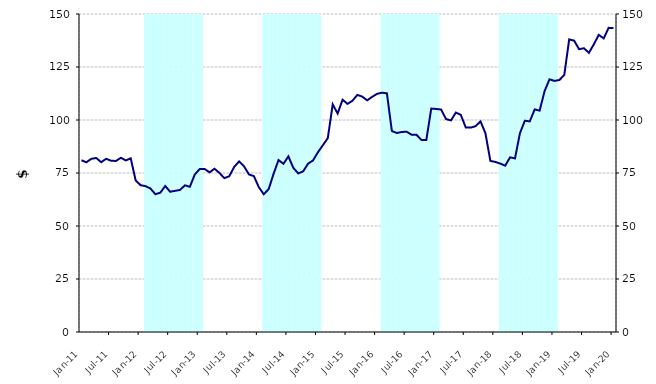
| Category | Series 1 |
|---|---|
| 0 | 0 |
| 1900-01-01 | 0 |
| 1900-01-02 | 0 |
| 1900-01-03 | 0 |
| 1900-01-04 | 0 |
| 1900-01-05 | 0 |
| 1900-01-06 | 0 |
| 1900-01-07 | 0 |
| 1900-01-08 | 0 |
| 1900-01-09 | 0 |
| 1900-01-10 | 0 |
| 1900-01-11 | 0 |
| 1900-01-12 | 0 |
| 1900-01-13 | 150000000 |
| 1900-01-14 | 150000000 |
| 1900-01-15 | 150000000 |
| 1900-01-16 | 150000000 |
| 1900-01-17 | 150000000 |
| 1900-01-18 | 150000000 |
| 1900-01-19 | 150000000 |
| 1900-01-20 | 150000000 |
| 1900-01-21 | 150000000 |
| 1900-01-22 | 150000000 |
| 1900-01-23 | 150000000 |
| 1900-01-24 | 150000000 |
| 1900-01-25 | 0 |
| 1900-01-26 | 0 |
| 1900-01-27 | 0 |
| 1900-01-28 | 0 |
| 1900-01-29 | 0 |
| 1900-01-30 | 0 |
| 1900-01-31 | 0 |
| 1900-02-01 | 0 |
| 1900-02-02 | 0 |
| 1900-02-03 | 0 |
| 1900-02-04 | 0 |
| 1900-02-05 | 0 |
| 1900-02-06 | 150000000 |
| 1900-02-07 | 150000000 |
| 1900-02-08 | 150000000 |
| 1900-02-09 | 150000000 |
| 1900-02-10 | 150000000 |
| 1900-02-11 | 150000000 |
| 1900-02-12 | 150000000 |
| 1900-02-13 | 150000000 |
| 1900-02-14 | 150000000 |
| 1900-02-15 | 150000000 |
| 1900-02-16 | 150000000 |
| 1900-02-17 | 150000000 |
| 1900-02-18 | 0 |
| 1900-02-19 | 0 |
| 1900-02-20 | 0 |
| 1900-02-21 | 0 |
| 1900-02-22 | 0 |
| 1900-02-23 | 0 |
| 1900-02-24 | 0 |
| 1900-02-25 | 0 |
| 1900-02-26 | 0 |
| 1900-02-27 | 0 |
| 1900-02-28 | 0 |
| 1900-02-28 | 0 |
| 1900-03-01 | 150000000 |
| 1900-03-02 | 150000000 |
| 1900-03-03 | 150000000 |
| 1900-03-04 | 150000000 |
| 1900-03-05 | 150000000 |
| 1900-03-06 | 150000000 |
| 1900-03-07 | 150000000 |
| 1900-03-08 | 150000000 |
| 1900-03-09 | 150000000 |
| 1900-03-10 | 150000000 |
| 1900-03-11 | 150000000 |
| 1900-03-12 | 150000000 |
| 1900-03-13 | 0 |
| 1900-03-14 | 0 |
| 1900-03-15 | 0 |
| 1900-03-16 | 0 |
| 1900-03-17 | 0 |
| 1900-03-18 | 0 |
| 1900-03-19 | 0 |
| 1900-03-20 | 0 |
| 1900-03-21 | 0 |
| 1900-03-22 | 0 |
| 1900-03-23 | 0 |
| 1900-03-24 | 0 |
| 1900-03-25 | 150000000 |
| 1900-03-26 | 150000000 |
| 1900-03-27 | 150000000 |
| 1900-03-28 | 150000000 |
| 1900-03-29 | 150000000 |
| 1900-03-30 | 150000000 |
| 1900-03-31 | 150000000 |
| 1900-04-01 | 150000000 |
| 1900-04-02 | 150000000 |
| 1900-04-03 | 150000000 |
| 1900-04-04 | 150000000 |
| 1900-04-05 | 150000000 |
| 1900-04-06 | 0 |
| 1900-04-07 | 0 |
| 1900-04-08 | 0 |
| 1900-04-09 | 0 |
| 1900-04-10 | 0 |
| 1900-04-11 | 0 |
| 1900-04-12 | 0 |
| 1900-04-13 | 0 |
| 1900-04-14 | 0 |
| 1900-04-15 | 0 |
| 1900-04-16 | 0 |
| 1900-04-17 | 0 |